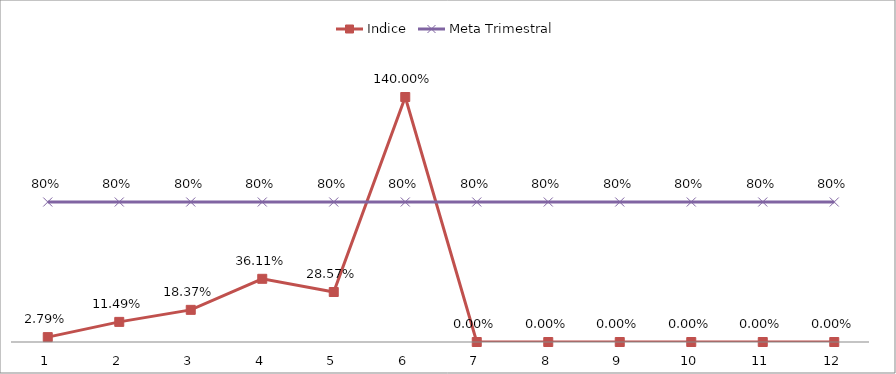
| Category | Indice | Meta Trimestral |
|---|---|---|
| 0 | 0.028 | 0.8 |
| 1 | 0.115 | 0.8 |
| 2 | 0.184 | 0.8 |
| 3 | 0.361 | 0.8 |
| 4 | 0.286 | 0.8 |
| 5 | 1.4 | 0.8 |
| 6 | 0 | 0.8 |
| 7 | 0 | 0.8 |
| 8 | 0 | 0.8 |
| 9 | 0 | 0.8 |
| 10 | 0 | 0.8 |
| 11 | 0 | 0.8 |